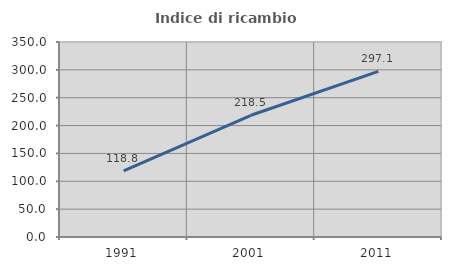
| Category | Indice di ricambio occupazionale  |
|---|---|
| 1991.0 | 118.75 |
| 2001.0 | 218.519 |
| 2011.0 | 297.143 |